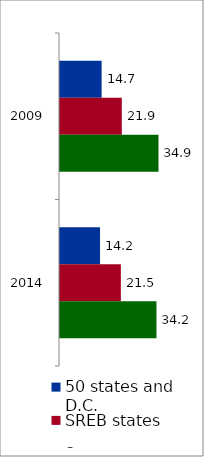
| Category | 50 states and D.C. | SREB states | State |
|---|---|---|---|
| 2009 | 14.731 | 21.885 | 34.862 |
| 2014 | 14.169 | 21.54 | 34.154 |